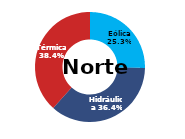
| Category | Norte |
|---|---|
| Eólica | 105.42 |
| Hidráulica | 151.67 |
| Solar | 0 |
| Térmica | 159.929 |